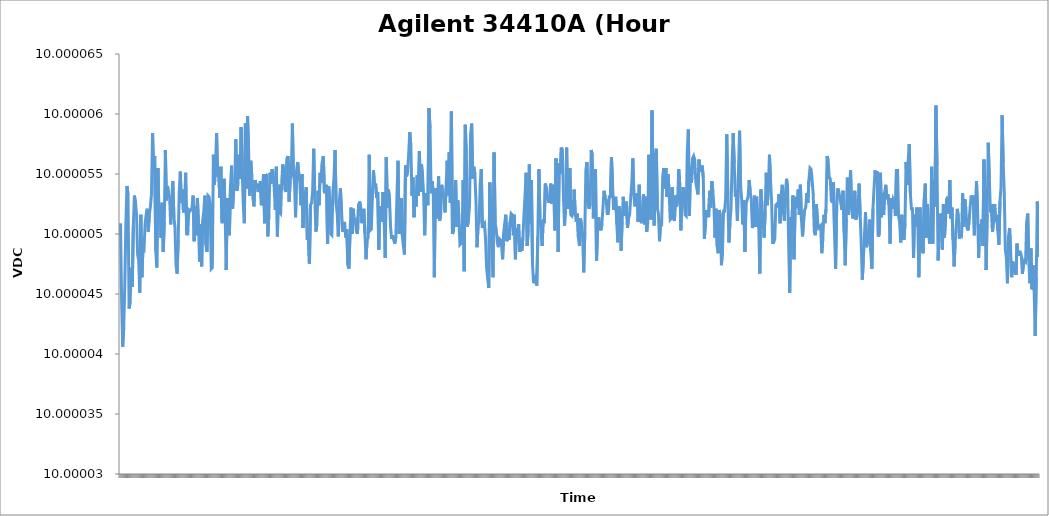
| Category | Channel 1 (VDC) |
|---|---|
| 0 | 10 |
| 1 | 10 |
| 2 | 10 |
| 3 | 10 |
| 4 | 10 |
| 5 | 10 |
| 6 | 10 |
| 7 | 10 |
| 8 | 10 |
| 9 | 10 |
| 10 | 10 |
| 11 | 10 |
| 12 | 10 |
| 13 | 10 |
| 14 | 10 |
| 15 | 10 |
| 16 | 10 |
| 17 | 10 |
| 18 | 10 |
| 19 | 10 |
| 20 | 10 |
| 21 | 10 |
| 22 | 10 |
| 23 | 10 |
| 24 | 10 |
| 25 | 10 |
| 26 | 10 |
| 27 | 10 |
| 28 | 10 |
| 29 | 10 |
| 30 | 10 |
| 31 | 10 |
| 32 | 10 |
| 33 | 10 |
| 34 | 10 |
| 35 | 10 |
| 36 | 10 |
| 37 | 10 |
| 38 | 10 |
| 39 | 10 |
| 40 | 10 |
| 41 | 10 |
| 42 | 10 |
| 43 | 10 |
| 44 | 10 |
| 45 | 10 |
| 46 | 10 |
| 47 | 10 |
| 48 | 10 |
| 49 | 10 |
| 50 | 10 |
| 51 | 10 |
| 52 | 10 |
| 53 | 10 |
| 54 | 10 |
| 55 | 10 |
| 56 | 10 |
| 57 | 10 |
| 58 | 10 |
| 59 | 10 |
| 60 | 10 |
| 61 | 10 |
| 62 | 10 |
| 63 | 10 |
| 64 | 10 |
| 65 | 10 |
| 66 | 10 |
| 67 | 10 |
| 68 | 10 |
| 69 | 10 |
| 70 | 10 |
| 71 | 10 |
| 72 | 10 |
| 73 | 10 |
| 74 | 10 |
| 75 | 10 |
| 76 | 10 |
| 77 | 10 |
| 78 | 10 |
| 79 | 10 |
| 80 | 10 |
| 81 | 10 |
| 82 | 10 |
| 83 | 10 |
| 84 | 10 |
| 85 | 10 |
| 86 | 10 |
| 87 | 10 |
| 88 | 10 |
| 89 | 10 |
| 90 | 10 |
| 91 | 10 |
| 92 | 10 |
| 93 | 10 |
| 94 | 10 |
| 95 | 10 |
| 96 | 10 |
| 97 | 10 |
| 98 | 10 |
| 99 | 10 |
| 100 | 10 |
| 101 | 10 |
| 102 | 10 |
| 103 | 10 |
| 104 | 10 |
| 105 | 10 |
| 106 | 10 |
| 107 | 10 |
| 108 | 10 |
| 109 | 10 |
| 110 | 10 |
| 111 | 10 |
| 112 | 10 |
| 113 | 10 |
| 114 | 10 |
| 115 | 10 |
| 116 | 10 |
| 117 | 10 |
| 118 | 10 |
| 119 | 10 |
| 120 | 10 |
| 121 | 10 |
| 122 | 10 |
| 123 | 10 |
| 124 | 10 |
| 125 | 10 |
| 126 | 10 |
| 127 | 10 |
| 128 | 10 |
| 129 | 10 |
| 130 | 10 |
| 131 | 10 |
| 132 | 10 |
| 133 | 10 |
| 134 | 10 |
| 135 | 10 |
| 136 | 10 |
| 137 | 10 |
| 138 | 10 |
| 139 | 10 |
| 140 | 10 |
| 141 | 10 |
| 142 | 10 |
| 143 | 10 |
| 144 | 10 |
| 145 | 10 |
| 146 | 10 |
| 147 | 10 |
| 148 | 10 |
| 149 | 10 |
| 150 | 10 |
| 151 | 10 |
| 152 | 10 |
| 153 | 10 |
| 154 | 10 |
| 155 | 10 |
| 156 | 10 |
| 157 | 10 |
| 158 | 10 |
| 159 | 10 |
| 160 | 10 |
| 161 | 10 |
| 162 | 10 |
| 163 | 10 |
| 164 | 10 |
| 165 | 10 |
| 166 | 10 |
| 167 | 10 |
| 168 | 10 |
| 169 | 10 |
| 170 | 10 |
| 171 | 10 |
| 172 | 10 |
| 173 | 10 |
| 174 | 10 |
| 175 | 10 |
| 176 | 10 |
| 177 | 10 |
| 178 | 10 |
| 179 | 10 |
| 180 | 10 |
| 181 | 10 |
| 182 | 10 |
| 183 | 10 |
| 184 | 10 |
| 185 | 10 |
| 186 | 10 |
| 187 | 10 |
| 188 | 10 |
| 189 | 10 |
| 190 | 10 |
| 191 | 10 |
| 192 | 10 |
| 193 | 10 |
| 194 | 10 |
| 195 | 10 |
| 196 | 10 |
| 197 | 10 |
| 198 | 10 |
| 199 | 10 |
| 200 | 10 |
| 201 | 10 |
| 202 | 10 |
| 203 | 10 |
| 204 | 10 |
| 205 | 10 |
| 206 | 10 |
| 207 | 10 |
| 208 | 10 |
| 209 | 10 |
| 210 | 10 |
| 211 | 10 |
| 212 | 10 |
| 213 | 10 |
| 214 | 10 |
| 215 | 10 |
| 216 | 10 |
| 217 | 10 |
| 218 | 10 |
| 219 | 10 |
| 220 | 10 |
| 221 | 10 |
| 222 | 10 |
| 223 | 10 |
| 224 | 10 |
| 225 | 10 |
| 226 | 10 |
| 227 | 10 |
| 228 | 10 |
| 229 | 10 |
| 230 | 10 |
| 231 | 10 |
| 232 | 10 |
| 233 | 10 |
| 234 | 10 |
| 235 | 10 |
| 236 | 10 |
| 237 | 10 |
| 238 | 10 |
| 239 | 10 |
| 240 | 10 |
| 241 | 10 |
| 242 | 10 |
| 243 | 10 |
| 244 | 10 |
| 245 | 10 |
| 246 | 10 |
| 247 | 10 |
| 248 | 10 |
| 249 | 10 |
| 250 | 10 |
| 251 | 10 |
| 252 | 10 |
| 253 | 10 |
| 254 | 10 |
| 255 | 10 |
| 256 | 10 |
| 257 | 10 |
| 258 | 10 |
| 259 | 10 |
| 260 | 10 |
| 261 | 10 |
| 262 | 10 |
| 263 | 10 |
| 264 | 10 |
| 265 | 10 |
| 266 | 10 |
| 267 | 10 |
| 268 | 10 |
| 269 | 10 |
| 270 | 10 |
| 271 | 10 |
| 272 | 10 |
| 273 | 10 |
| 274 | 10 |
| 275 | 10 |
| 276 | 10 |
| 277 | 10 |
| 278 | 10 |
| 279 | 10 |
| 280 | 10 |
| 281 | 10 |
| 282 | 10 |
| 283 | 10 |
| 284 | 10 |
| 285 | 10 |
| 286 | 10 |
| 287 | 10 |
| 288 | 10 |
| 289 | 10 |
| 290 | 10 |
| 291 | 10 |
| 292 | 10 |
| 293 | 10 |
| 294 | 10 |
| 295 | 10 |
| 296 | 10 |
| 297 | 10 |
| 298 | 10 |
| 299 | 10 |
| 300 | 10 |
| 301 | 10 |
| 302 | 10 |
| 303 | 10 |
| 304 | 10 |
| 305 | 10 |
| 306 | 10 |
| 307 | 10 |
| 308 | 10 |
| 309 | 10 |
| 310 | 10 |
| 311 | 10 |
| 312 | 10 |
| 313 | 10 |
| 314 | 10 |
| 315 | 10 |
| 316 | 10 |
| 317 | 10 |
| 318 | 10 |
| 319 | 10 |
| 320 | 10 |
| 321 | 10 |
| 322 | 10 |
| 323 | 10 |
| 324 | 10 |
| 325 | 10 |
| 326 | 10 |
| 327 | 10 |
| 328 | 10 |
| 329 | 10 |
| 330 | 10 |
| 331 | 10 |
| 332 | 10 |
| 333 | 10 |
| 334 | 10 |
| 335 | 10 |
| 336 | 10 |
| 337 | 10 |
| 338 | 10 |
| 339 | 10 |
| 340 | 10 |
| 341 | 10 |
| 342 | 10 |
| 343 | 10 |
| 344 | 10 |
| 345 | 10 |
| 346 | 10 |
| 347 | 10 |
| 348 | 10 |
| 349 | 10 |
| 350 | 10 |
| 351 | 10 |
| 352 | 10 |
| 353 | 10 |
| 354 | 10 |
| 355 | 10 |
| 356 | 10 |
| 357 | 10 |
| 358 | 10 |
| 359 | 10 |
| 360 | 10 |
| 361 | 10 |
| 362 | 10 |
| 363 | 10 |
| 364 | 10 |
| 365 | 10 |
| 366 | 10 |
| 367 | 10 |
| 368 | 10 |
| 369 | 10 |
| 370 | 10 |
| 371 | 10 |
| 372 | 10 |
| 373 | 10 |
| 374 | 10 |
| 375 | 10 |
| 376 | 10 |
| 377 | 10 |
| 378 | 10 |
| 379 | 10 |
| 380 | 10 |
| 381 | 10 |
| 382 | 10 |
| 383 | 10 |
| 384 | 10 |
| 385 | 10 |
| 386 | 10 |
| 387 | 10 |
| 388 | 10 |
| 389 | 10 |
| 390 | 10 |
| 391 | 10 |
| 392 | 10 |
| 393 | 10 |
| 394 | 10 |
| 395 | 10 |
| 396 | 10 |
| 397 | 10 |
| 398 | 10 |
| 399 | 10 |
| 400 | 10 |
| 401 | 10 |
| 402 | 10 |
| 403 | 10 |
| 404 | 10 |
| 405 | 10 |
| 406 | 10 |
| 407 | 10 |
| 408 | 10 |
| 409 | 10 |
| 410 | 10 |
| 411 | 10 |
| 412 | 10 |
| 413 | 10 |
| 414 | 10 |
| 415 | 10 |
| 416 | 10 |
| 417 | 10 |
| 418 | 10 |
| 419 | 10 |
| 420 | 10 |
| 421 | 10 |
| 422 | 10 |
| 423 | 10 |
| 424 | 10 |
| 425 | 10 |
| 426 | 10 |
| 427 | 10 |
| 428 | 10 |
| 429 | 10 |
| 430 | 10 |
| 431 | 10 |
| 432 | 10 |
| 433 | 10 |
| 434 | 10 |
| 435 | 10 |
| 436 | 10 |
| 437 | 10 |
| 438 | 10 |
| 439 | 10 |
| 440 | 10 |
| 441 | 10 |
| 442 | 10 |
| 443 | 10 |
| 444 | 10 |
| 445 | 10 |
| 446 | 10 |
| 447 | 10 |
| 448 | 10 |
| 449 | 10 |
| 450 | 10 |
| 451 | 10 |
| 452 | 10 |
| 453 | 10 |
| 454 | 10 |
| 455 | 10 |
| 456 | 10 |
| 457 | 10 |
| 458 | 10 |
| 459 | 10 |
| 460 | 10 |
| 461 | 10 |
| 462 | 10 |
| 463 | 10 |
| 464 | 10 |
| 465 | 10 |
| 466 | 10 |
| 467 | 10 |
| 468 | 10 |
| 469 | 10 |
| 470 | 10 |
| 471 | 10 |
| 472 | 10 |
| 473 | 10 |
| 474 | 10 |
| 475 | 10 |
| 476 | 10 |
| 477 | 10 |
| 478 | 10 |
| 479 | 10 |
| 480 | 10 |
| 481 | 10 |
| 482 | 10 |
| 483 | 10 |
| 484 | 10 |
| 485 | 10 |
| 486 | 10 |
| 487 | 10 |
| 488 | 10 |
| 489 | 10 |
| 490 | 10 |
| 491 | 10 |
| 492 | 10 |
| 493 | 10 |
| 494 | 10 |
| 495 | 10 |
| 496 | 10 |
| 497 | 10 |
| 498 | 10 |
| 499 | 10 |
| 500 | 10 |
| 501 | 10 |
| 502 | 10 |
| 503 | 10 |
| 504 | 10 |
| 505 | 10 |
| 506 | 10 |
| 507 | 10 |
| 508 | 10 |
| 509 | 10 |
| 510 | 10 |
| 511 | 10 |
| 512 | 10 |
| 513 | 10 |
| 514 | 10 |
| 515 | 10 |
| 516 | 10 |
| 517 | 10 |
| 518 | 10 |
| 519 | 10 |
| 520 | 10 |
| 521 | 10 |
| 522 | 10 |
| 523 | 10 |
| 524 | 10 |
| 525 | 10 |
| 526 | 10 |
| 527 | 10 |
| 528 | 10 |
| 529 | 10 |
| 530 | 10 |
| 531 | 10 |
| 532 | 10 |
| 533 | 10 |
| 534 | 10 |
| 535 | 10 |
| 536 | 10 |
| 537 | 10 |
| 538 | 10 |
| 539 | 10 |
| 540 | 10 |
| 541 | 10 |
| 542 | 10 |
| 543 | 10 |
| 544 | 10 |
| 545 | 10 |
| 546 | 10 |
| 547 | 10 |
| 548 | 10 |
| 549 | 10 |
| 550 | 10 |
| 551 | 10 |
| 552 | 10 |
| 553 | 10 |
| 554 | 10 |
| 555 | 10 |
| 556 | 10 |
| 557 | 10 |
| 558 | 10 |
| 559 | 10 |
| 560 | 10 |
| 561 | 10 |
| 562 | 10 |
| 563 | 10 |
| 564 | 10 |
| 565 | 10 |
| 566 | 10 |
| 567 | 10 |
| 568 | 10 |
| 569 | 10 |
| 570 | 10 |
| 571 | 10 |
| 572 | 10 |
| 573 | 10 |
| 574 | 10 |
| 575 | 10 |
| 576 | 10 |
| 577 | 10 |
| 578 | 10 |
| 579 | 10 |
| 580 | 10 |
| 581 | 10 |
| 582 | 10 |
| 583 | 10 |
| 584 | 10 |
| 585 | 10 |
| 586 | 10 |
| 587 | 10 |
| 588 | 10 |
| 589 | 10 |
| 590 | 10 |
| 591 | 10 |
| 592 | 10 |
| 593 | 10 |
| 594 | 10 |
| 595 | 10 |
| 596 | 10 |
| 597 | 10 |
| 598 | 10 |
| 599 | 10 |
| 600 | 10 |
| 601 | 10 |
| 602 | 10 |
| 603 | 10 |
| 604 | 10 |
| 605 | 10 |
| 606 | 10 |
| 607 | 10 |
| 608 | 10 |
| 609 | 10 |
| 610 | 10 |
| 611 | 10 |
| 612 | 10 |
| 613 | 10 |
| 614 | 10 |
| 615 | 10 |
| 616 | 10 |
| 617 | 10 |
| 618 | 10 |
| 619 | 10 |
| 620 | 10 |
| 621 | 10 |
| 622 | 10 |
| 623 | 10 |
| 624 | 10 |
| 625 | 10 |
| 626 | 10 |
| 627 | 10 |
| 628 | 10 |
| 629 | 10 |
| 630 | 10 |
| 631 | 10 |
| 632 | 10 |
| 633 | 10 |
| 634 | 10 |
| 635 | 10 |
| 636 | 10 |
| 637 | 10 |
| 638 | 10 |
| 639 | 10 |
| 640 | 10 |
| 641 | 10 |
| 642 | 10 |
| 643 | 10 |
| 644 | 10 |
| 645 | 10 |
| 646 | 10 |
| 647 | 10 |
| 648 | 10 |
| 649 | 10 |
| 650 | 10 |
| 651 | 10 |
| 652 | 10 |
| 653 | 10 |
| 654 | 10 |
| 655 | 10 |
| 656 | 10 |
| 657 | 10 |
| 658 | 10 |
| 659 | 10 |
| 660 | 10 |
| 661 | 10 |
| 662 | 10 |
| 663 | 10 |
| 664 | 10 |
| 665 | 10 |
| 666 | 10 |
| 667 | 10 |
| 668 | 10 |
| 669 | 10 |
| 670 | 10 |
| 671 | 10 |
| 672 | 10 |
| 673 | 10 |
| 674 | 10 |
| 675 | 10 |
| 676 | 10 |
| 677 | 10 |
| 678 | 10 |
| 679 | 10 |
| 680 | 10 |
| 681 | 10 |
| 682 | 10 |
| 683 | 10 |
| 684 | 10 |
| 685 | 10 |
| 686 | 10 |
| 687 | 10 |
| 688 | 10 |
| 689 | 10 |
| 690 | 10 |
| 691 | 10 |
| 692 | 10 |
| 693 | 10 |
| 694 | 10 |
| 695 | 10 |
| 696 | 10 |
| 697 | 10 |
| 698 | 10 |
| 699 | 10 |
| 700 | 10 |
| 701 | 10 |
| 702 | 10 |
| 703 | 10 |
| 704 | 10 |
| 705 | 10 |
| 706 | 10 |
| 707 | 10 |
| 708 | 10 |
| 709 | 10 |
| 710 | 10 |
| 711 | 10 |
| 712 | 10 |
| 713 | 10 |
| 714 | 10 |
| 715 | 10 |
| 716 | 10 |
| 717 | 10 |
| 718 | 10 |
| 719 | 10 |
| 720 | 10 |
| 721 | 10 |
| 722 | 10 |
| 723 | 10 |
| 724 | 10 |
| 725 | 10 |
| 726 | 10 |
| 727 | 10 |
| 728 | 10 |
| 729 | 10 |
| 730 | 10 |
| 731 | 10 |
| 732 | 10 |
| 733 | 10 |
| 734 | 10 |
| 735 | 10 |
| 736 | 10 |
| 737 | 10 |
| 738 | 10 |
| 739 | 10 |
| 740 | 10 |
| 741 | 10 |
| 742 | 10 |
| 743 | 10 |
| 744 | 10 |
| 745 | 10 |
| 746 | 10 |
| 747 | 10 |
| 748 | 10 |
| 749 | 10 |
| 750 | 10 |
| 751 | 10 |
| 752 | 10 |
| 753 | 10 |
| 754 | 10 |
| 755 | 10 |
| 756 | 10 |
| 757 | 10 |
| 758 | 10 |
| 759 | 10 |
| 760 | 10 |
| 761 | 10 |
| 762 | 10 |
| 763 | 10 |
| 764 | 10 |
| 765 | 10 |
| 766 | 10 |
| 767 | 10 |
| 768 | 10 |
| 769 | 10 |
| 770 | 10 |
| 771 | 10 |
| 772 | 10 |
| 773 | 10 |
| 774 | 10 |
| 775 | 10 |
| 776 | 10 |
| 777 | 10 |
| 778 | 10 |
| 779 | 10 |
| 780 | 10 |
| 781 | 10 |
| 782 | 10 |
| 783 | 10 |
| 784 | 10 |
| 785 | 10 |
| 786 | 10 |
| 787 | 10 |
| 788 | 10 |
| 789 | 10 |
| 790 | 10 |
| 791 | 10 |
| 792 | 10 |
| 793 | 10 |
| 794 | 10 |
| 795 | 10 |
| 796 | 10 |
| 797 | 10 |
| 798 | 10 |
| 799 | 10 |
| 800 | 10 |
| 801 | 10 |
| 802 | 10 |
| 803 | 10 |
| 804 | 10 |
| 805 | 10 |
| 806 | 10 |
| 807 | 10 |
| 808 | 10 |
| 809 | 10 |
| 810 | 10 |
| 811 | 10 |
| 812 | 10 |
| 813 | 10 |
| 814 | 10 |
| 815 | 10 |
| 816 | 10 |
| 817 | 10 |
| 818 | 10 |
| 819 | 10 |
| 820 | 10 |
| 821 | 10 |
| 822 | 10 |
| 823 | 10 |
| 824 | 10 |
| 825 | 10 |
| 826 | 10 |
| 827 | 10 |
| 828 | 10 |
| 829 | 10 |
| 830 | 10 |
| 831 | 10 |
| 832 | 10 |
| 833 | 10 |
| 834 | 10 |
| 835 | 10 |
| 836 | 10 |
| 837 | 10 |
| 838 | 10 |
| 839 | 10 |
| 840 | 10 |
| 841 | 10 |
| 842 | 10 |
| 843 | 10 |
| 844 | 10 |
| 845 | 10 |
| 846 | 10 |
| 847 | 10 |
| 848 | 10 |
| 849 | 10 |
| 850 | 10 |
| 851 | 10 |
| 852 | 10 |
| 853 | 10 |
| 854 | 10 |
| 855 | 10 |
| 856 | 10 |
| 857 | 10 |
| 858 | 10 |
| 859 | 10 |
| 860 | 10 |
| 861 | 10 |